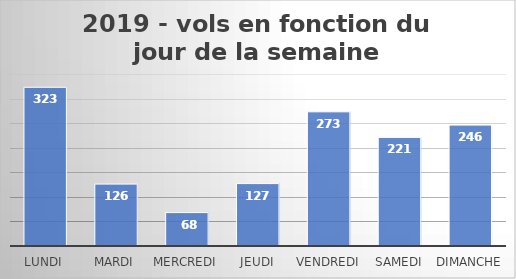
| Category | Nombre de vols |
|---|---|
| Lundi | 323 |
| Mardi | 126 |
| Mercredi | 68 |
| Jeudi | 127 |
| Vendredi | 273 |
| Samedi | 221 |
| Dimanche | 246 |